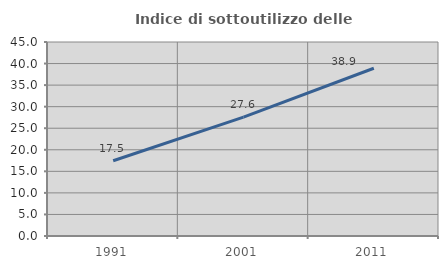
| Category | Indice di sottoutilizzo delle abitazioni  |
|---|---|
| 1991.0 | 17.452 |
| 2001.0 | 27.559 |
| 2011.0 | 38.906 |